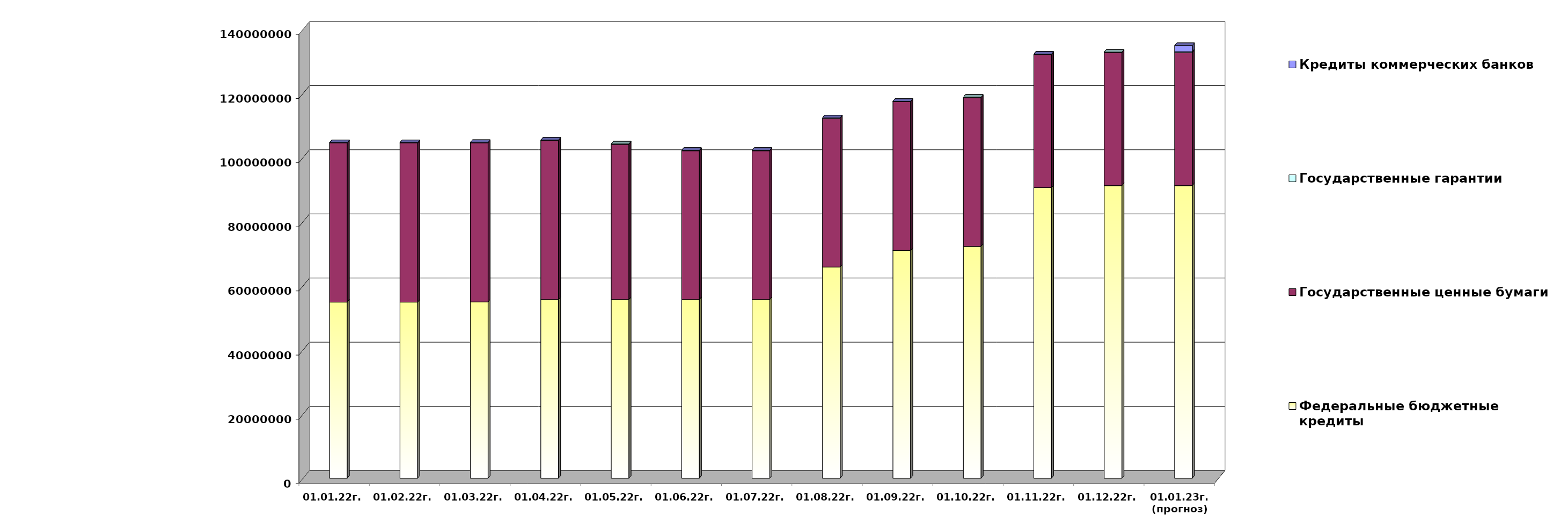
| Category | Федеральные бюджетные кредиты | Государственные ценные бумаги  | Государственные гарантии | Кредиты коммерческих банков |
|---|---|---|---|---|
| 01.01.22г. | 54900618.713 | 49600000 | 141570.67 | 0 |
| 01.02.22г. | 54900618.713 | 49600000 | 139748.87 | 0 |
| 01.03.22г. | 54970753.113 | 49600000 | 139748.87 | 0 |
| 01.04.22г. | 55700753.113 | 49600000 | 139748.87 | 0 |
| 01.05.22г. | 55700753.113 | 48400000 | 138270.964 | 0 |
| 01.06.22г. | 55705077.413 | 46400000 | 138270.964 | 0 |
| 01.07.22г. | 55705077.413 | 46400000 | 138270.964 | 0 |
| 01.08.22г. | 65845099.48 | 46400000 | 134576.199 | 0 |
| 01.09.22г. | 71000838.41 | 46400000 | 134576.199 | 0 |
| 01.10.22г. | 72274148.94 | 46400000 | 134576.199 | 0 |
| 01.11.22г. | 90603290.06 | 41500000 | 129957.74 | 0 |
| 01.12.22г. | 91228290.06 | 41500000 | 129957.74 | 0 |
| 01.01.23г.
(прогноз) | 91228290.06 | 41500000 | 265278.1 | 1942700 |